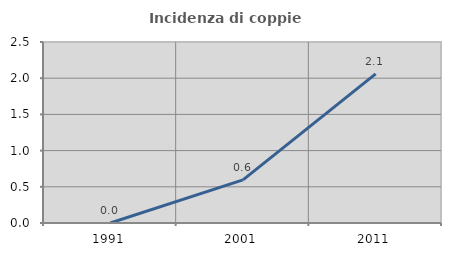
| Category | Incidenza di coppie miste |
|---|---|
| 1991.0 | 0 |
| 2001.0 | 0.597 |
| 2011.0 | 2.061 |